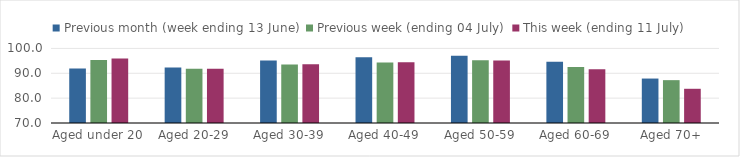
| Category | Previous month (week ending 13 June) | Previous week (ending 04 July) | This week (ending 11 July) |
|---|---|---|---|
| Aged under 20 | 91.954 | 95.3 | 95.964 |
| Aged 20-29 | 92.327 | 91.841 | 91.781 |
| Aged 30-39 | 95.094 | 93.538 | 93.645 |
| Aged 40-49 | 96.482 | 94.315 | 94.414 |
| Aged 50-59 | 97.019 | 95.282 | 95.193 |
| Aged 60-69 | 94.605 | 92.492 | 91.615 |
| Aged 70+ | 87.881 | 87.239 | 83.764 |